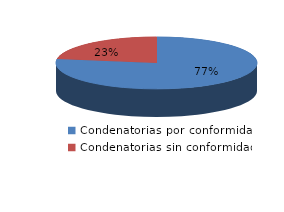
| Category | Series 0 |
|---|---|
| 0 | 157 |
| 1 | 46 |